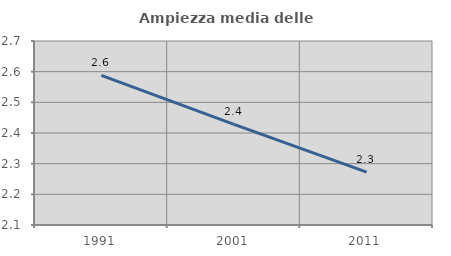
| Category | Ampiezza media delle famiglie |
|---|---|
| 1991.0 | 2.588 |
| 2001.0 | 2.428 |
| 2011.0 | 2.272 |